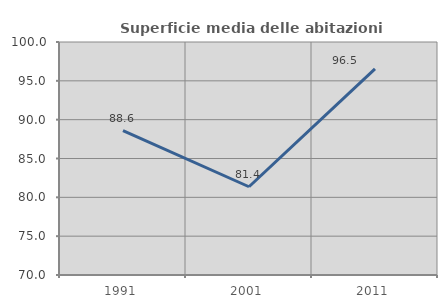
| Category | Superficie media delle abitazioni occupate |
|---|---|
| 1991.0 | 88.603 |
| 2001.0 | 81.363 |
| 2011.0 | 96.542 |